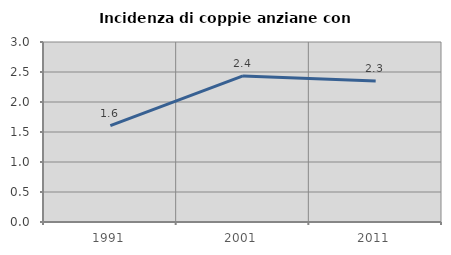
| Category | Incidenza di coppie anziane con figli |
|---|---|
| 1991.0 | 1.605 |
| 2001.0 | 2.435 |
| 2011.0 | 2.349 |